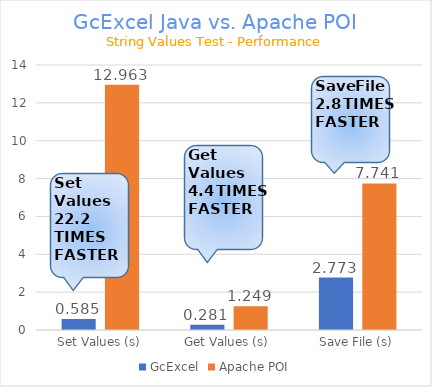
| Category | GcExcel | Apache POI |
|---|---|---|
| Set Values (s) | 0.585 | 12.963 |
| Get Values (s) | 0.281 | 1.249 |
| Save File (s) | 2.773 | 7.741 |